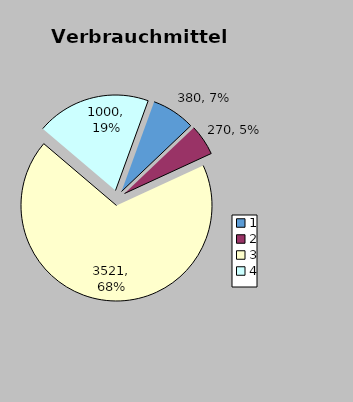
| Category | Series 0 |
|---|---|
| 0 | 380 |
| 1 | 270 |
| 2 | 3521 |
| 3 | 1000 |